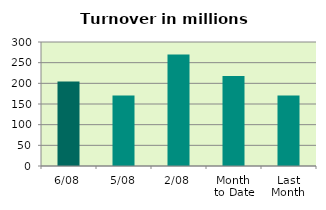
| Category | Series 0 |
|---|---|
| 6/08 | 204.171 |
| 5/08 | 170.576 |
| 2/08 | 269.912 |
| Month 
to Date | 217.575 |
| Last
Month | 170.387 |